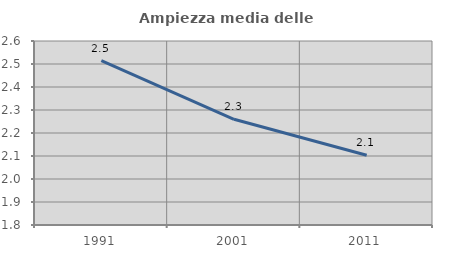
| Category | Ampiezza media delle famiglie |
|---|---|
| 1991.0 | 2.515 |
| 2001.0 | 2.26 |
| 2011.0 | 2.103 |